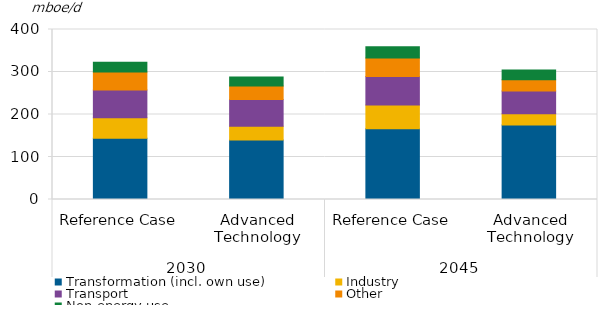
| Category | Transformation (incl. own use) | Industry | Transport | Other | Non-energy use |
|---|---|---|---|---|---|
| 0 | 144.266 | 48.159 | 65.094 | 42.673 | 22.702 |
| 1 | 140.001 | 32.497 | 62.854 | 31.898 | 21.221 |
| 2 | 166.716 | 55.464 | 67.459 | 43.501 | 26.081 |
| 3 | 175.205 | 26.705 | 53.605 | 26.217 | 22.765 |